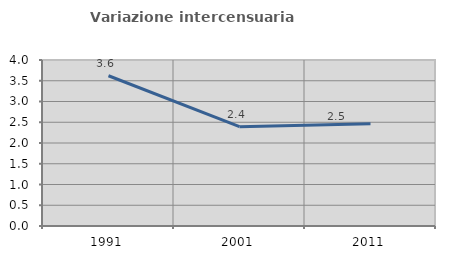
| Category | Variazione intercensuaria annua |
|---|---|
| 1991.0 | 3.62 |
| 2001.0 | 2.393 |
| 2011.0 | 2.463 |